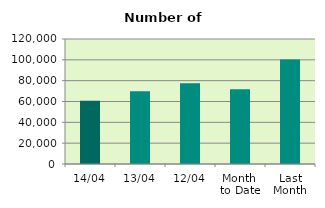
| Category | Series 0 |
|---|---|
| 14/04 | 60644 |
| 13/04 | 69954 |
| 12/04 | 77612 |
| Month 
to Date | 71758.8 |
| Last
Month | 100276.783 |